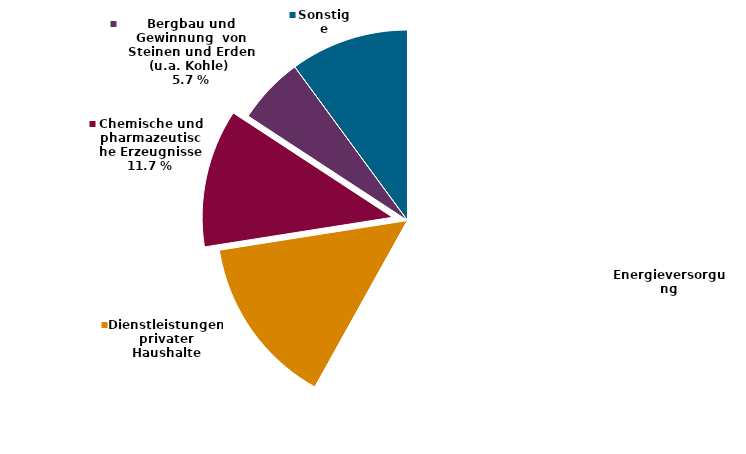
| Category | Series 0 |
|---|---|
| Energieversorgung | 12897 |
| Dienstleistungen privater Haushalte | 3205 |
| Chemische und pharmazeutische Erzeugnisse | 2602 |
| Bergbau und Gewinnung  von Steinen und Erden (u.a. Kohle)  | 1264 |
| Sonstige | 2238 |